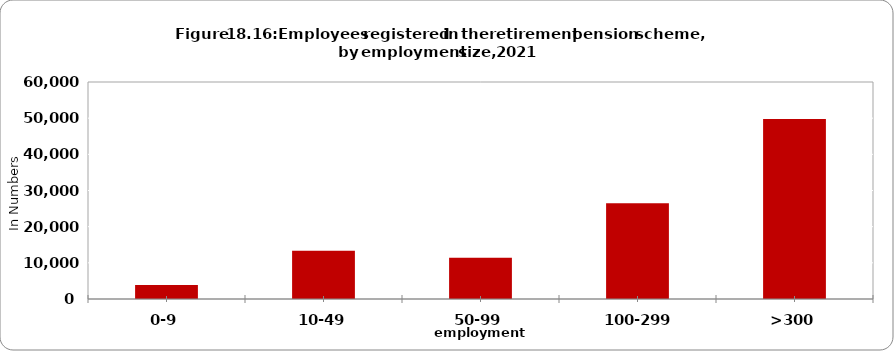
| Category | Series 0 |
|---|---|
| 0-9 | 3858 |
| 10-49 | 13344 |
| 50-99 | 11375 |
| 100-299 | 26450 |
| >300 | 49745 |